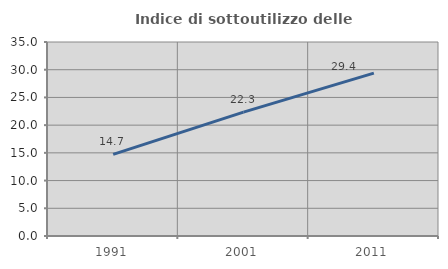
| Category | Indice di sottoutilizzo delle abitazioni  |
|---|---|
| 1991.0 | 14.715 |
| 2001.0 | 22.345 |
| 2011.0 | 29.39 |